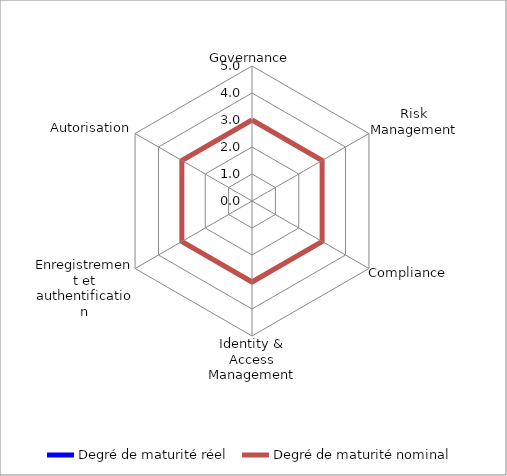
| Category | Degré de maturité réel | Degré de maturité nominal |
|---|---|---|
| Governance | 0 | 3 |
| Risk Management | 0 | 3 |
| Compliance | 0 | 3 |
| Identity & Access Management | 0 | 3 |
| Enregistrement et authentification | 0 | 3 |
| Autorisation | 0 | 3 |